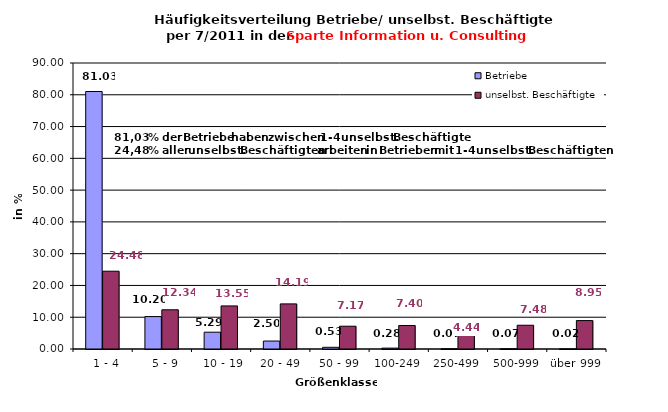
| Category | Betriebe | unselbst. Beschäftigte |
|---|---|---|
|   1 - 4 | 81.03 | 24.48 |
|   5 - 9 | 10.204 | 12.343 |
|  10 - 19 | 5.288 | 13.553 |
| 20 - 49 | 2.505 | 14.192 |
| 50 - 99 | 0.533 | 7.174 |
| 100-249 | 0.278 | 7.398 |
| 250-499 | 0.07 | 4.436 |
| 500-999 | 0.07 | 7.476 |
| über 999 | 0.023 | 8.949 |